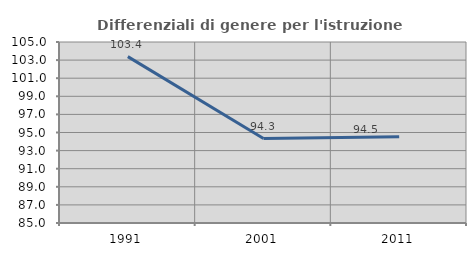
| Category | Differenziali di genere per l'istruzione superiore |
|---|---|
| 1991.0 | 103.38 |
| 2001.0 | 94.333 |
| 2011.0 | 94.52 |